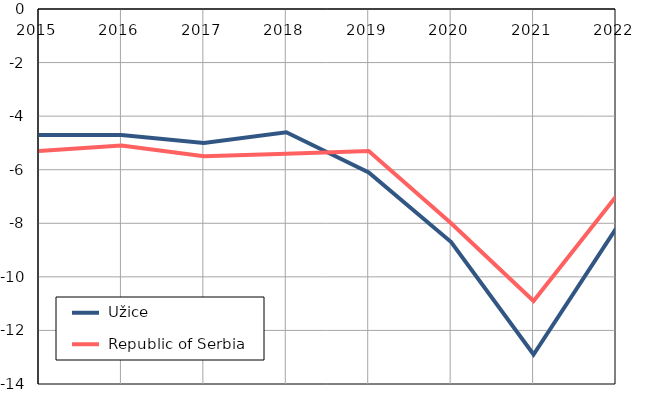
| Category |  Užice |  Republic of Serbia |
|---|---|---|
| 2015.0 | -4.7 | -5.3 |
| 2016.0 | -4.7 | -5.1 |
| 2017.0 | -5 | -5.5 |
| 2018.0 | -4.6 | -5.4 |
| 2019.0 | -6.1 | -5.3 |
| 2020.0 | -8.7 | -8 |
| 2021.0 | -12.9 | -10.9 |
| 2022.0 | -8.2 | -7 |